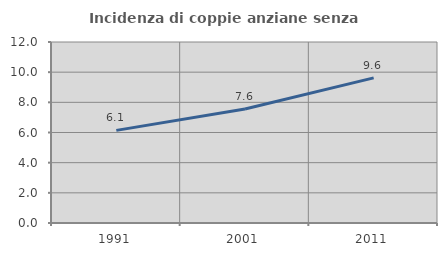
| Category | Incidenza di coppie anziane senza figli  |
|---|---|
| 1991.0 | 6.141 |
| 2001.0 | 7.561 |
| 2011.0 | 9.619 |